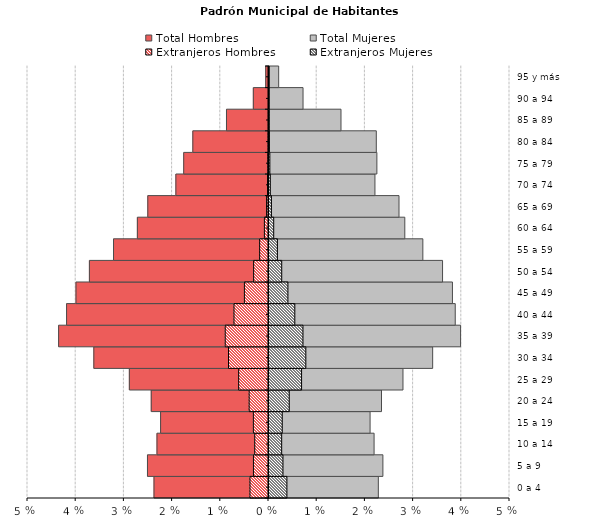
| Category | Total Hombres | Total Mujeres | Extranjeros Hombres | Extranjeros Mujeres |
|---|---|---|---|---|
| 0 a 4 | -0.024 | 0.023 | -0.004 | 0.004 |
| 5 a 9 | -0.025 | 0.024 | -0.003 | 0.003 |
| 10 a 14 | -0.023 | 0.022 | -0.003 | 0.003 |
| 15 a 19 | -0.022 | 0.021 | -0.003 | 0.003 |
| 20 a 24 | -0.024 | 0.023 | -0.004 | 0.004 |
| 25 a 29 | -0.029 | 0.028 | -0.006 | 0.007 |
| 30 a 34 | -0.036 | 0.034 | -0.008 | 0.008 |
| 35 a 39 | -0.044 | 0.04 | -0.009 | 0.007 |
| 40 a 44 | -0.042 | 0.039 | -0.007 | 0.005 |
| 45 a 49 | -0.04 | 0.038 | -0.005 | 0.004 |
| 50 a 54 | -0.037 | 0.036 | -0.003 | 0.003 |
| 55 a 59 | -0.032 | 0.032 | -0.002 | 0.002 |
| 60 a 64 | -0.027 | 0.028 | -0.001 | 0.001 |
| 65 a 69 | -0.025 | 0.027 | 0 | 0.001 |
| 70 a 74 | -0.019 | 0.022 | 0 | 0 |
| 75 a 79 | -0.018 | 0.022 | 0 | 0 |
| 80 a 84 | -0.016 | 0.022 | 0 | 0 |
| 85 a 89 | -0.009 | 0.015 | 0 | 0 |
| 90 a 94 | -0.003 | 0.007 | 0 | 0 |
| 95 y más | -0.001 | 0.002 | 0 | 0 |